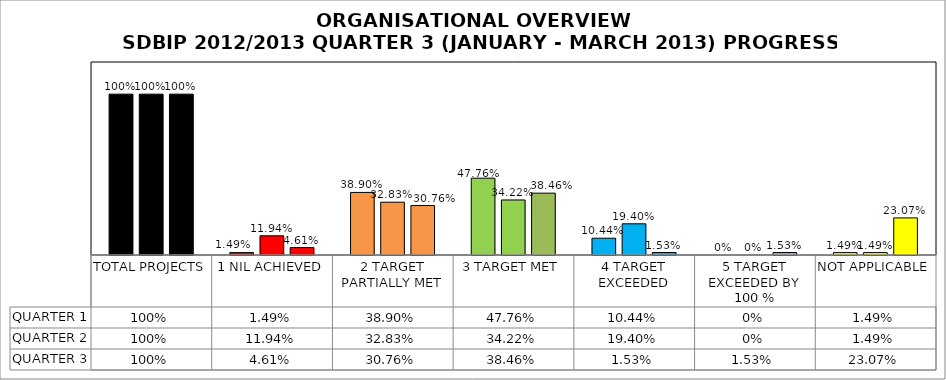
| Category | QUARTER 1 | QUARTER 2 | QUARTER 3 |
|---|---|---|---|
| TOTAL PROJECTS | 1 | 1 | 1 |
| 1 NIL ACHIEVED | 0.015 | 0.119 | 0.046 |
| 2 TARGET PARTIALLY MET | 0.389 | 0.328 | 0.308 |
| 3 TARGET MET | 0.478 | 0.342 | 0.385 |
| 4 TARGET EXCEEDED | 0.104 | 0.194 | 0.015 |
| 5 TARGET EXCEEDED BY 100 % | 0 | 0 | 0.015 |
| NOT APPLICABLE | 0.015 | 0.015 | 0.231 |